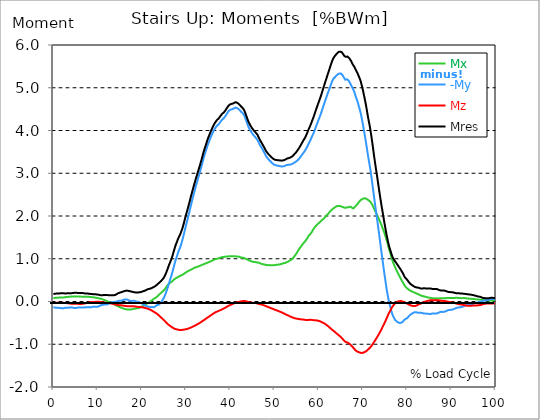
| Category |  Mx |  -My |  Mz |  Mres |
|---|---|---|---|---|
| 0.0 | 0.083 | -0.134 | -0.034 | 0.174 |
| 0.167348456675344 | 0.083 | -0.137 | -0.034 | 0.178 |
| 0.334696913350688 | 0.084 | -0.142 | -0.032 | 0.181 |
| 0.5020453700260321 | 0.086 | -0.143 | -0.031 | 0.184 |
| 0.669393826701376 | 0.087 | -0.146 | -0.031 | 0.186 |
| 0.83674228337672 | 0.088 | -0.147 | -0.031 | 0.187 |
| 1.0040907400520642 | 0.09 | -0.147 | -0.031 | 0.187 |
| 1.1621420602454444 | 0.091 | -0.147 | -0.032 | 0.189 |
| 1.3294905169207885 | 0.091 | -0.15 | -0.032 | 0.189 |
| 1.4968389735961325 | 0.091 | -0.153 | -0.034 | 0.192 |
| 1.6641874302714765 | 0.091 | -0.155 | -0.034 | 0.193 |
| 1.8315358869468206 | 0.091 | -0.158 | -0.034 | 0.195 |
| 1.9988843436221646 | 0.093 | -0.158 | -0.032 | 0.195 |
| 2.1662328002975086 | 0.093 | -0.158 | -0.031 | 0.195 |
| 2.333581256972853 | 0.094 | -0.156 | -0.031 | 0.193 |
| 2.5009297136481967 | 0.097 | -0.152 | -0.032 | 0.19 |
| 2.6682781703235405 | 0.1 | -0.146 | -0.034 | 0.187 |
| 2.8356266269988843 | 0.102 | -0.143 | -0.037 | 0.187 |
| 3.002975083674229 | 0.105 | -0.146 | -0.038 | 0.19 |
| 3.1703235403495724 | 0.106 | -0.147 | -0.04 | 0.193 |
| 3.337671997024917 | 0.108 | -0.146 | -0.041 | 0.193 |
| 3.4957233172182973 | 0.111 | -0.143 | -0.043 | 0.193 |
| 3.663071773893641 | 0.112 | -0.142 | -0.046 | 0.193 |
| 3.8304202305689854 | 0.114 | -0.139 | -0.049 | 0.192 |
| 3.997768687244329 | 0.115 | -0.137 | -0.052 | 0.193 |
| 4.165117143919673 | 0.117 | -0.139 | -0.053 | 0.195 |
| 4.332465600595017 | 0.117 | -0.143 | -0.053 | 0.198 |
| 4.499814057270361 | 0.118 | -0.147 | -0.053 | 0.201 |
| 4.667162513945706 | 0.118 | -0.15 | -0.053 | 0.202 |
| 4.834510970621049 | 0.117 | -0.152 | -0.053 | 0.204 |
| 5.001859427296393 | 0.118 | -0.152 | -0.052 | 0.204 |
| 5.169207883971737 | 0.119 | -0.15 | -0.052 | 0.204 |
| 5.336556340647081 | 0.119 | -0.147 | -0.053 | 0.202 |
| 5.503904797322425 | 0.119 | -0.143 | -0.055 | 0.199 |
| 5.671253253997769 | 0.118 | -0.139 | -0.056 | 0.198 |
| 5.82930457419115 | 0.117 | -0.137 | -0.058 | 0.196 |
| 5.996653030866494 | 0.115 | -0.137 | -0.058 | 0.196 |
| 6.164001487541838 | 0.115 | -0.14 | -0.058 | 0.198 |
| 6.331349944217181 | 0.114 | -0.142 | -0.056 | 0.198 |
| 6.498698400892526 | 0.114 | -0.143 | -0.055 | 0.198 |
| 6.66604685756787 | 0.114 | -0.143 | -0.052 | 0.196 |
| 6.833395314243213 | 0.112 | -0.142 | -0.049 | 0.195 |
| 7.000743770918558 | 0.112 | -0.14 | -0.046 | 0.192 |
| 7.168092227593902 | 0.112 | -0.136 | -0.043 | 0.189 |
| 7.335440684269246 | 0.114 | -0.133 | -0.041 | 0.186 |
| 7.50278914094459 | 0.114 | -0.131 | -0.038 | 0.186 |
| 7.6701375976199335 | 0.114 | -0.133 | -0.034 | 0.186 |
| 7.837486054295278 | 0.112 | -0.133 | -0.031 | 0.184 |
| 7.995537374488658 | 0.109 | -0.133 | -0.027 | 0.183 |
| 8.162885831164003 | 0.108 | -0.133 | -0.021 | 0.18 |
| 8.330234287839346 | 0.106 | -0.134 | -0.016 | 0.178 |
| 8.49758274451469 | 0.105 | -0.134 | -0.013 | 0.178 |
| 8.664931201190035 | 0.102 | -0.133 | -0.01 | 0.177 |
| 8.832279657865378 | 0.1 | -0.125 | -0.01 | 0.174 |
| 8.999628114540721 | 0.097 | -0.122 | -0.009 | 0.17 |
| 9.166976571216066 | 0.096 | -0.121 | -0.009 | 0.168 |
| 9.334325027891412 | 0.094 | -0.122 | -0.009 | 0.168 |
| 9.501673484566755 | 0.091 | -0.125 | -0.009 | 0.168 |
| 9.669021941242098 | 0.087 | -0.125 | -0.007 | 0.167 |
| 9.836370397917442 | 0.084 | -0.125 | -0.007 | 0.167 |
| 10.003718854592787 | 0.081 | -0.124 | -0.006 | 0.164 |
| 10.17106731126813 | 0.077 | -0.115 | -0.006 | 0.159 |
| 10.329118631461512 | 0.074 | -0.106 | -0.007 | 0.155 |
| 10.496467088136853 | 0.069 | -0.097 | -0.009 | 0.152 |
| 10.663815544812199 | 0.065 | -0.09 | -0.01 | 0.149 |
| 10.831164001487544 | 0.059 | -0.084 | -0.013 | 0.146 |
| 10.998512458162887 | 0.055 | -0.08 | -0.016 | 0.145 |
| 11.16586091483823 | 0.049 | -0.075 | -0.019 | 0.147 |
| 11.333209371513574 | 0.043 | -0.074 | -0.022 | 0.15 |
| 11.50055782818892 | 0.035 | -0.072 | -0.025 | 0.152 |
| 11.667906284864264 | 0.031 | -0.071 | -0.028 | 0.149 |
| 11.835254741539607 | 0.022 | -0.071 | -0.029 | 0.149 |
| 12.00260319821495 | 0.015 | -0.069 | -0.032 | 0.15 |
| 12.169951654890292 | 0.006 | -0.066 | -0.034 | 0.15 |
| 12.337300111565641 | -0.001 | -0.06 | -0.035 | 0.149 |
| 12.504648568240984 | -0.007 | -0.052 | -0.037 | 0.147 |
| 12.662699888434362 | -0.015 | -0.043 | -0.038 | 0.149 |
| 12.830048345109708 | -0.021 | -0.032 | -0.041 | 0.15 |
| 12.997396801785053 | -0.028 | -0.025 | -0.046 | 0.146 |
| 13.164745258460396 | -0.032 | -0.021 | -0.049 | 0.143 |
| 13.33209371513574 | -0.041 | -0.016 | -0.052 | 0.145 |
| 13.499442171811083 | -0.05 | -0.015 | -0.055 | 0.145 |
| 13.666790628486426 | -0.06 | -0.01 | -0.059 | 0.146 |
| 13.834139085161771 | -0.071 | -0.007 | -0.063 | 0.147 |
| 14.001487541837117 | -0.08 | -0.007 | -0.068 | 0.155 |
| 14.16883599851246 | -0.09 | -0.004 | -0.071 | 0.164 |
| 14.336184455187803 | -0.099 | -0.001 | -0.075 | 0.173 |
| 14.503532911863147 | -0.108 | 0.004 | -0.078 | 0.183 |
| 14.670881368538492 | -0.117 | 0.013 | -0.083 | 0.195 |
| 14.828932688731873 | -0.122 | 0.016 | -0.086 | 0.201 |
| 14.996281145407215 | -0.13 | 0.016 | -0.087 | 0.206 |
| 15.163629602082558 | -0.136 | 0.018 | -0.088 | 0.211 |
| 15.330978058757903 | -0.145 | 0.019 | -0.088 | 0.217 |
| 15.498326515433247 | -0.152 | 0.024 | -0.09 | 0.223 |
| 15.665674972108594 | -0.158 | 0.029 | -0.093 | 0.229 |
| 15.833023428783937 | -0.165 | 0.038 | -0.097 | 0.236 |
| 16.00037188545928 | -0.171 | 0.044 | -0.1 | 0.242 |
| 16.167720342134626 | -0.176 | 0.049 | -0.103 | 0.248 |
| 16.335068798809967 | -0.178 | 0.049 | -0.106 | 0.251 |
| 16.502417255485312 | -0.184 | 0.049 | -0.108 | 0.255 |
| 16.669765712160658 | -0.187 | 0.044 | -0.109 | 0.255 |
| 16.837114168836 | -0.189 | 0.037 | -0.111 | 0.252 |
| 17.004462625511344 | -0.189 | 0.029 | -0.111 | 0.248 |
| 17.16251394570472 | -0.189 | 0.022 | -0.111 | 0.243 |
| 17.32986240238007 | -0.19 | 0.016 | -0.111 | 0.24 |
| 17.497210859055414 | -0.189 | 0.016 | -0.111 | 0.237 |
| 17.664559315730756 | -0.184 | 0.01 | -0.109 | 0.232 |
| 17.8319077724061 | -0.18 | 0.013 | -0.109 | 0.227 |
| 17.999256229081443 | -0.174 | 0.016 | -0.111 | 0.223 |
| 18.166604685756788 | -0.171 | 0.018 | -0.112 | 0.218 |
| 18.333953142432133 | -0.168 | 0.015 | -0.114 | 0.215 |
| 18.501301599107478 | -0.164 | 0.009 | -0.117 | 0.211 |
| 18.668650055782823 | -0.162 | 0.001 | -0.119 | 0.211 |
| 18.835998512458165 | -0.161 | -0.003 | -0.122 | 0.211 |
| 19.00334696913351 | -0.158 | -0.007 | -0.124 | 0.211 |
| 19.170695425808855 | -0.158 | -0.006 | -0.127 | 0.214 |
| 19.338043882484197 | -0.153 | -0.009 | -0.128 | 0.214 |
| 19.496095202677576 | -0.145 | -0.019 | -0.128 | 0.214 |
| 19.66344365935292 | -0.137 | -0.031 | -0.13 | 0.218 |
| 19.830792116028263 | -0.128 | -0.037 | -0.133 | 0.223 |
| 19.998140572703612 | -0.119 | -0.047 | -0.134 | 0.229 |
| 20.165489029378953 | -0.111 | -0.058 | -0.137 | 0.236 |
| 20.3328374860543 | -0.1 | -0.068 | -0.14 | 0.242 |
| 20.500185942729644 | -0.088 | -0.08 | -0.145 | 0.246 |
| 20.667534399404985 | -0.075 | -0.093 | -0.149 | 0.252 |
| 20.83488285608033 | -0.063 | -0.099 | -0.153 | 0.26 |
| 21.002231312755672 | -0.056 | -0.106 | -0.158 | 0.27 |
| 21.16957976943102 | -0.047 | -0.112 | -0.162 | 0.279 |
| 21.336928226106362 | -0.038 | -0.118 | -0.168 | 0.288 |
| 21.504276682781704 | -0.027 | -0.122 | -0.174 | 0.292 |
| 21.67162513945705 | -0.016 | -0.124 | -0.181 | 0.295 |
| 21.82967645965043 | -0.006 | -0.125 | -0.189 | 0.298 |
| 21.997024916325774 | 0.009 | -0.133 | -0.198 | 0.304 |
| 22.16437337300112 | 0.019 | -0.13 | -0.206 | 0.31 |
| 22.33172182967646 | 0.029 | -0.128 | -0.217 | 0.319 |
| 22.499070286351806 | 0.046 | -0.133 | -0.226 | 0.329 |
| 22.666418743027148 | 0.06 | -0.136 | -0.237 | 0.338 |
| 22.833767199702496 | 0.071 | -0.13 | -0.249 | 0.347 |
| 23.00111565637784 | 0.081 | -0.118 | -0.26 | 0.357 |
| 23.168464113053183 | 0.09 | -0.103 | -0.27 | 0.367 |
| 23.335812569728528 | 0.102 | -0.088 | -0.28 | 0.383 |
| 23.50316102640387 | 0.117 | -0.081 | -0.294 | 0.4 |
| 23.670509483079215 | 0.134 | -0.08 | -0.308 | 0.416 |
| 23.83785793975456 | 0.153 | -0.075 | -0.323 | 0.432 |
| 23.995909259947936 | 0.171 | -0.06 | -0.339 | 0.445 |
| 24.163257716623285 | 0.186 | -0.041 | -0.355 | 0.46 |
| 24.330606173298627 | 0.201 | -0.021 | -0.372 | 0.476 |
| 24.49795462997397 | 0.214 | 0.003 | -0.386 | 0.494 |
| 24.665303086649313 | 0.23 | 0.029 | -0.403 | 0.515 |
| 24.83265154332466 | 0.246 | 0.06 | -0.42 | 0.538 |
| 25.0 | 0.264 | 0.091 | -0.437 | 0.563 |
| 25.167348456675345 | 0.283 | 0.128 | -0.454 | 0.593 |
| 25.334696913350694 | 0.307 | 0.171 | -0.472 | 0.631 |
| 25.502045370026035 | 0.332 | 0.218 | -0.49 | 0.671 |
| 25.669393826701377 | 0.357 | 0.268 | -0.509 | 0.715 |
| 25.836742283376722 | 0.378 | 0.319 | -0.524 | 0.76 |
| 26.004090740052067 | 0.401 | 0.378 | -0.54 | 0.811 |
| 26.17143919672741 | 0.42 | 0.432 | -0.553 | 0.857 |
| 26.329490516920792 | 0.432 | 0.49 | -0.566 | 0.901 |
| 26.49683897359613 | 0.441 | 0.543 | -0.578 | 0.942 |
| 26.66418743027148 | 0.453 | 0.596 | -0.59 | 0.987 |
| 26.831535886946828 | 0.469 | 0.656 | -0.602 | 1.037 |
| 26.998884343622166 | 0.485 | 0.72 | -0.614 | 1.091 |
| 27.166232800297514 | 0.503 | 0.786 | -0.625 | 1.153 |
| 27.333581256972852 | 0.519 | 0.853 | -0.634 | 1.212 |
| 27.5009297136482 | 0.531 | 0.917 | -0.642 | 1.27 |
| 27.668278170323543 | 0.543 | 0.976 | -0.646 | 1.323 |
| 27.835626626998888 | 0.553 | 1.028 | -0.65 | 1.369 |
| 28.002975083674233 | 0.562 | 1.08 | -0.653 | 1.412 |
| 28.170323540349575 | 0.572 | 1.134 | -0.658 | 1.459 |
| 28.33767199702492 | 0.583 | 1.183 | -0.662 | 1.5 |
| 28.50502045370026 | 0.59 | 1.223 | -0.665 | 1.532 |
| 28.663071773893645 | 0.6 | 1.264 | -0.668 | 1.568 |
| 28.830420230568986 | 0.609 | 1.316 | -0.67 | 1.612 |
| 28.99776868724433 | 0.617 | 1.376 | -0.667 | 1.661 |
| 29.165117143919673 | 0.622 | 1.435 | -0.664 | 1.708 |
| 29.33246560059502 | 0.633 | 1.503 | -0.659 | 1.768 |
| 29.499814057270367 | 0.645 | 1.572 | -0.656 | 1.83 |
| 29.66716251394571 | 0.659 | 1.643 | -0.656 | 1.897 |
| 29.834510970621054 | 0.673 | 1.715 | -0.652 | 1.965 |
| 30.00185942729639 | 0.683 | 1.786 | -0.649 | 2.029 |
| 30.169207883971744 | 0.693 | 1.854 | -0.646 | 2.091 |
| 30.33655634064708 | 0.704 | 1.919 | -0.639 | 2.15 |
| 30.50390479732243 | 0.714 | 1.988 | -0.633 | 2.215 |
| 30.671253253997772 | 0.721 | 2.06 | -0.627 | 2.28 |
| 30.829304574191156 | 0.729 | 2.133 | -0.619 | 2.347 |
| 30.996653030866494 | 0.737 | 2.204 | -0.612 | 2.413 |
| 31.164001487541842 | 0.748 | 2.276 | -0.606 | 2.481 |
| 31.331349944217187 | 0.757 | 2.347 | -0.599 | 2.547 |
| 31.498698400892525 | 0.765 | 2.417 | -0.591 | 2.611 |
| 31.666046857567874 | 0.776 | 2.482 | -0.581 | 2.673 |
| 31.833395314243212 | 0.786 | 2.546 | -0.572 | 2.733 |
| 32.00074377091856 | 0.794 | 2.611 | -0.565 | 2.794 |
| 32.1680922275939 | 0.799 | 2.677 | -0.555 | 2.855 |
| 32.33544068426925 | 0.804 | 2.739 | -0.546 | 2.913 |
| 32.50278914094459 | 0.808 | 2.798 | -0.537 | 2.966 |
| 32.670137597619934 | 0.816 | 2.864 | -0.527 | 3.028 |
| 32.83748605429528 | 0.824 | 2.92 | -0.519 | 3.083 |
| 33.004834510970625 | 0.83 | 2.978 | -0.509 | 3.139 |
| 33.162885831164004 | 0.836 | 3.038 | -0.497 | 3.196 |
| 33.33023428783935 | 0.844 | 3.103 | -0.484 | 3.258 |
| 33.497582744514695 | 0.851 | 3.165 | -0.472 | 3.317 |
| 33.664931201190036 | 0.858 | 3.232 | -0.462 | 3.381 |
| 33.83227965786538 | 0.866 | 3.301 | -0.45 | 3.447 |
| 33.99962811454073 | 0.873 | 3.364 | -0.438 | 3.507 |
| 34.16697657121607 | 0.881 | 3.422 | -0.426 | 3.563 |
| 34.33432502789141 | 0.886 | 3.478 | -0.414 | 3.618 |
| 34.50167348456676 | 0.894 | 3.531 | -0.401 | 3.67 |
| 34.6690219412421 | 0.9 | 3.587 | -0.389 | 3.724 |
| 34.83637039791744 | 0.907 | 3.642 | -0.378 | 3.777 |
| 35.00371885459279 | 0.914 | 3.69 | -0.366 | 3.826 |
| 35.17106731126814 | 0.923 | 3.733 | -0.354 | 3.867 |
| 35.338415767943474 | 0.931 | 3.777 | -0.342 | 3.912 |
| 35.49646708813686 | 0.937 | 3.822 | -0.33 | 3.954 |
| 35.6638155448122 | 0.944 | 3.861 | -0.319 | 3.996 |
| 35.831164001487544 | 0.954 | 3.903 | -0.307 | 4.035 |
| 35.998512458162885 | 0.963 | 3.94 | -0.295 | 4.072 |
| 36.165860914838234 | 0.972 | 3.973 | -0.285 | 4.108 |
| 36.333209371513576 | 0.979 | 4.01 | -0.273 | 4.145 |
| 36.50055782818892 | 0.985 | 4.041 | -0.263 | 4.174 |
| 36.667906284864266 | 0.991 | 4.066 | -0.251 | 4.199 |
| 36.83525474153961 | 0.996 | 4.09 | -0.242 | 4.223 |
| 37.002603198214956 | 1 | 4.114 | -0.236 | 4.248 |
| 37.1699516548903 | 1.004 | 4.128 | -0.23 | 4.263 |
| 37.337300111565646 | 1.009 | 4.142 | -0.224 | 4.276 |
| 37.50464856824098 | 1.016 | 4.158 | -0.217 | 4.294 |
| 37.66269988843437 | 1.024 | 4.186 | -0.206 | 4.322 |
| 37.83004834510971 | 1.029 | 4.211 | -0.198 | 4.347 |
| 37.99739680178505 | 1.034 | 4.229 | -0.19 | 4.363 |
| 38.16474525846039 | 1.037 | 4.257 | -0.181 | 4.391 |
| 38.33209371513574 | 1.04 | 4.271 | -0.174 | 4.406 |
| 38.49944217181109 | 1.043 | 4.285 | -0.167 | 4.417 |
| 38.666790628486424 | 1.044 | 4.301 | -0.158 | 4.434 |
| 38.83413908516178 | 1.047 | 4.327 | -0.147 | 4.46 |
| 39.001487541837115 | 1.05 | 4.353 | -0.137 | 4.485 |
| 39.16883599851246 | 1.052 | 4.382 | -0.127 | 4.513 |
| 39.336184455187805 | 1.053 | 4.407 | -0.117 | 4.538 |
| 39.503532911863154 | 1.056 | 4.437 | -0.108 | 4.566 |
| 39.670881368538495 | 1.058 | 4.457 | -0.097 | 4.586 |
| 39.83822982521384 | 1.058 | 4.473 | -0.088 | 4.602 |
| 39.996281145407224 | 1.059 | 4.484 | -0.081 | 4.612 |
| 40.163629602082565 | 1.06 | 4.491 | -0.074 | 4.619 |
| 40.33097805875791 | 1.059 | 4.494 | -0.068 | 4.622 |
| 40.498326515433256 | 1.059 | 4.5 | -0.06 | 4.627 |
| 40.6656749721086 | 1.059 | 4.509 | -0.052 | 4.636 |
| 40.83302342878393 | 1.058 | 4.516 | -0.044 | 4.643 |
| 41.00037188545929 | 1.058 | 4.528 | -0.035 | 4.653 |
| 41.16772034213463 | 1.056 | 4.535 | -0.028 | 4.662 |
| 41.33506879880997 | 1.055 | 4.532 | -0.024 | 4.659 |
| 41.50241725548531 | 1.053 | 4.527 | -0.019 | 4.652 |
| 41.66976571216066 | 1.052 | 4.516 | -0.015 | 4.642 |
| 41.837114168836 | 1.049 | 4.504 | -0.012 | 4.63 |
| 42.004462625511344 | 1.047 | 4.493 | -0.007 | 4.618 |
| 42.17181108218669 | 1.04 | 4.471 | -0.003 | 4.594 |
| 42.32986240238007 | 1.034 | 4.453 | 0.001 | 4.575 |
| 42.497210859055414 | 1.029 | 4.434 | 0.004 | 4.556 |
| 42.66455931573076 | 1.024 | 4.416 | 0.007 | 4.537 |
| 42.831907772406105 | 1.024 | 4.403 | 0.01 | 4.524 |
| 42.999256229081446 | 1.022 | 4.385 | 0.012 | 4.507 |
| 43.16660468575679 | 1.018 | 4.351 | 0.01 | 4.472 |
| 43.33395314243214 | 1.009 | 4.307 | 0.009 | 4.428 |
| 43.50130159910748 | 1 | 4.26 | 0.004 | 4.379 |
| 43.66865005578282 | 0.991 | 4.211 | 0 | 4.332 |
| 43.83599851245817 | 0.982 | 4.162 | -0.004 | 4.283 |
| 44.00334696913351 | 0.973 | 4.115 | -0.01 | 4.236 |
| 44.17069542580886 | 0.966 | 4.071 | -0.016 | 4.192 |
| 44.3380438824842 | 0.959 | 4.038 | -0.021 | 4.159 |
| 44.49609520267758 | 0.951 | 4.006 | -0.024 | 4.125 |
| 44.66344365935292 | 0.944 | 3.979 | -0.025 | 4.099 |
| 44.83079211602827 | 0.937 | 3.951 | -0.028 | 4.069 |
| 44.99814057270361 | 0.932 | 3.926 | -0.029 | 4.044 |
| 45.16548902937895 | 0.929 | 3.901 | -0.031 | 4.021 |
| 45.332837486054295 | 0.926 | 3.881 | -0.032 | 4 |
| 45.500185942729644 | 0.923 | 3.861 | -0.034 | 3.981 |
| 45.66753439940499 | 0.922 | 3.844 | -0.037 | 3.962 |
| 45.83488285608033 | 0.919 | 3.823 | -0.04 | 3.941 |
| 46.00223131275568 | 0.914 | 3.802 | -0.041 | 3.922 |
| 46.16957976943102 | 0.914 | 3.777 | -0.046 | 3.897 |
| 46.336928226106366 | 0.91 | 3.74 | -0.053 | 3.86 |
| 46.50427668278171 | 0.901 | 3.704 | -0.058 | 3.822 |
| 46.671625139457056 | 0.897 | 3.667 | -0.063 | 3.786 |
| 46.829676459650436 | 0.889 | 3.64 | -0.066 | 3.757 |
| 46.99702491632577 | 0.882 | 3.611 | -0.069 | 3.727 |
| 47.16437337300112 | 0.876 | 3.583 | -0.074 | 3.698 |
| 47.33172182967646 | 0.873 | 3.55 | -0.08 | 3.667 |
| 47.49907028635181 | 0.87 | 3.518 | -0.086 | 3.634 |
| 47.66641874302716 | 0.866 | 3.488 | -0.091 | 3.605 |
| 47.83376719970249 | 0.863 | 3.456 | -0.099 | 3.572 |
| 48.001115656377834 | 0.858 | 3.419 | -0.108 | 3.535 |
| 48.16846411305319 | 0.853 | 3.391 | -0.114 | 3.509 |
| 48.33581256972853 | 0.848 | 3.37 | -0.118 | 3.487 |
| 48.50316102640387 | 0.85 | 3.345 | -0.125 | 3.463 |
| 48.67050948307921 | 0.853 | 3.323 | -0.134 | 3.442 |
| 48.837857939754564 | 0.851 | 3.304 | -0.14 | 3.423 |
| 49.005206396429905 | 0.848 | 3.285 | -0.146 | 3.404 |
| 49.163257716623285 | 0.848 | 3.27 | -0.153 | 3.389 |
| 49.33060617329863 | 0.85 | 3.251 | -0.161 | 3.372 |
| 49.49795462997397 | 0.85 | 3.235 | -0.168 | 3.357 |
| 49.66530308664932 | 0.85 | 3.22 | -0.174 | 3.342 |
| 49.832651543324666 | 0.848 | 3.206 | -0.181 | 3.329 |
| 50.0 | 0.851 | 3.195 | -0.189 | 3.319 |
| 50.16734845667534 | 0.854 | 3.19 | -0.195 | 3.314 |
| 50.33469691335069 | 0.857 | 3.186 | -0.202 | 3.311 |
| 50.50204537002604 | 0.86 | 3.181 | -0.208 | 3.308 |
| 50.66939382670139 | 0.86 | 3.178 | -0.214 | 3.307 |
| 50.836742283376715 | 0.863 | 3.176 | -0.22 | 3.304 |
| 51.00409074005207 | 0.864 | 3.173 | -0.227 | 3.301 |
| 51.17143919672741 | 0.867 | 3.17 | -0.235 | 3.301 |
| 51.32949051692079 | 0.872 | 3.167 | -0.242 | 3.299 |
| 51.496838973596134 | 0.876 | 3.161 | -0.249 | 3.295 |
| 51.66418743027148 | 0.882 | 3.156 | -0.257 | 3.294 |
| 51.831535886946824 | 0.888 | 3.159 | -0.265 | 3.298 |
| 51.99888434362217 | 0.894 | 3.164 | -0.273 | 3.304 |
| 52.16623280029752 | 0.897 | 3.167 | -0.283 | 3.307 |
| 52.33358125697285 | 0.9 | 3.171 | -0.292 | 3.313 |
| 52.5009297136482 | 0.907 | 3.18 | -0.299 | 3.323 |
| 52.668278170323546 | 0.914 | 3.189 | -0.307 | 3.335 |
| 52.835626626998895 | 0.922 | 3.195 | -0.314 | 3.344 |
| 53.00297508367424 | 0.931 | 3.196 | -0.323 | 3.348 |
| 53.17032354034958 | 0.94 | 3.198 | -0.332 | 3.353 |
| 53.33767199702492 | 0.951 | 3.195 | -0.341 | 3.355 |
| 53.50502045370027 | 0.96 | 3.201 | -0.348 | 3.364 |
| 53.663071773893655 | 0.971 | 3.205 | -0.355 | 3.372 |
| 53.83042023056899 | 0.981 | 3.211 | -0.363 | 3.382 |
| 53.99776868724433 | 0.996 | 3.217 | -0.37 | 3.394 |
| 54.16511714391967 | 1.012 | 3.227 | -0.378 | 3.409 |
| 54.33246560059503 | 1.035 | 3.239 | -0.383 | 3.428 |
| 54.49981405727037 | 1.056 | 3.249 | -0.389 | 3.447 |
| 54.667162513945705 | 1.08 | 3.261 | -0.394 | 3.465 |
| 54.834510970621054 | 1.105 | 3.271 | -0.398 | 3.484 |
| 55.0018594272964 | 1.131 | 3.282 | -0.401 | 3.504 |
| 55.169207883971744 | 1.161 | 3.298 | -0.404 | 3.529 |
| 55.336556340647086 | 1.19 | 3.314 | -0.407 | 3.556 |
| 55.50390479732243 | 1.214 | 3.332 | -0.41 | 3.581 |
| 55.671253253997776 | 1.24 | 3.351 | -0.413 | 3.609 |
| 55.83860171067312 | 1.264 | 3.375 | -0.416 | 3.639 |
| 55.9966530308665 | 1.288 | 3.4 | -0.417 | 3.67 |
| 56.16400148754184 | 1.313 | 3.423 | -0.42 | 3.701 |
| 56.33134994421718 | 1.336 | 3.448 | -0.422 | 3.732 |
| 56.498698400892536 | 1.358 | 3.472 | -0.423 | 3.763 |
| 56.66604685756788 | 1.379 | 3.496 | -0.425 | 3.791 |
| 56.83339531424321 | 1.398 | 3.519 | -0.428 | 3.819 |
| 57.00074377091856 | 1.417 | 3.547 | -0.431 | 3.853 |
| 57.16809222759391 | 1.442 | 3.577 | -0.432 | 3.889 |
| 57.33544068426925 | 1.471 | 3.611 | -0.432 | 3.929 |
| 57.5027891409446 | 1.496 | 3.646 | -0.432 | 3.972 |
| 57.670137597619934 | 1.528 | 3.681 | -0.432 | 4.016 |
| 57.83748605429528 | 1.549 | 3.714 | -0.431 | 4.053 |
| 58.004834510970625 | 1.565 | 3.749 | -0.428 | 4.091 |
| 58.16288583116401 | 1.584 | 3.786 | -0.428 | 4.133 |
| 58.330234287839346 | 1.609 | 3.826 | -0.429 | 4.178 |
| 58.497582744514695 | 1.636 | 3.867 | -0.431 | 4.227 |
| 58.66493120119004 | 1.668 | 3.901 | -0.435 | 4.27 |
| 58.832279657865385 | 1.699 | 3.938 | -0.44 | 4.316 |
| 58.999628114540734 | 1.721 | 3.984 | -0.44 | 4.366 |
| 59.16697657121607 | 1.745 | 4.029 | -0.44 | 4.417 |
| 59.33432502789142 | 1.764 | 4.077 | -0.44 | 4.469 |
| 59.50167348456676 | 1.783 | 4.124 | -0.441 | 4.519 |
| 59.66902194124211 | 1.802 | 4.168 | -0.445 | 4.569 |
| 59.83637039791745 | 1.819 | 4.215 | -0.45 | 4.619 |
| 60.00371885459278 | 1.832 | 4.261 | -0.453 | 4.665 |
| 60.17106731126813 | 1.848 | 4.304 | -0.459 | 4.712 |
| 60.33841576794349 | 1.866 | 4.35 | -0.465 | 4.761 |
| 60.49646708813685 | 1.881 | 4.395 | -0.472 | 4.81 |
| 60.6638155448122 | 1.895 | 4.447 | -0.481 | 4.864 |
| 60.831164001487544 | 1.913 | 4.503 | -0.49 | 4.923 |
| 60.99851245816289 | 1.929 | 4.558 | -0.499 | 4.979 |
| 61.16586091483824 | 1.942 | 4.608 | -0.506 | 5.032 |
| 61.333209371513576 | 1.96 | 4.659 | -0.516 | 5.087 |
| 61.50055782818892 | 1.978 | 4.712 | -0.528 | 5.143 |
| 61.667906284864266 | 2 | 4.758 | -0.541 | 5.195 |
| 61.835254741539615 | 2.022 | 4.805 | -0.555 | 5.248 |
| 62.002603198214956 | 2.04 | 4.857 | -0.568 | 5.302 |
| 62.16995165489029 | 2.055 | 4.906 | -0.58 | 5.354 |
| 62.33730011156564 | 2.077 | 4.951 | -0.596 | 5.407 |
| 62.504648568240995 | 2.1 | 4.999 | -0.612 | 5.46 |
| 62.67199702491633 | 2.118 | 5.049 | -0.628 | 5.515 |
| 62.83004834510971 | 2.136 | 5.094 | -0.645 | 5.565 |
| 62.99739680178505 | 2.15 | 5.142 | -0.659 | 5.617 |
| 63.1647452584604 | 2.164 | 5.181 | -0.671 | 5.659 |
| 63.33209371513575 | 2.177 | 5.214 | -0.684 | 5.696 |
| 63.4994421718111 | 2.192 | 5.235 | -0.699 | 5.723 |
| 63.666790628486424 | 2.205 | 5.246 | -0.714 | 5.74 |
| 63.83413908516177 | 2.215 | 5.268 | -0.73 | 5.767 |
| 64.00148754183712 | 2.226 | 5.286 | -0.745 | 5.789 |
| 64.16883599851248 | 2.233 | 5.301 | -0.758 | 5.807 |
| 64.3361844551878 | 2.236 | 5.316 | -0.773 | 5.824 |
| 64.50353291186315 | 2.236 | 5.329 | -0.786 | 5.838 |
| 64.6708813685385 | 2.236 | 5.332 | -0.801 | 5.844 |
| 64.83822982521384 | 2.233 | 5.332 | -0.817 | 5.845 |
| 65.00557828188919 | 2.23 | 5.333 | -0.83 | 5.847 |
| 65.16362960208257 | 2.221 | 5.322 | -0.848 | 5.835 |
| 65.3309780587579 | 2.212 | 5.301 | -0.867 | 5.816 |
| 65.49832651543326 | 2.206 | 5.271 | -0.888 | 5.791 |
| 65.6656749721086 | 2.198 | 5.243 | -0.907 | 5.764 |
| 65.83302342878395 | 2.195 | 5.214 | -0.925 | 5.739 |
| 66.00037188545929 | 2.192 | 5.187 | -0.941 | 5.717 |
| 66.16772034213463 | 2.195 | 5.192 | -0.948 | 5.723 |
| 66.33506879880998 | 2.199 | 5.199 | -0.954 | 5.732 |
| 66.50241725548531 | 2.202 | 5.193 | -0.962 | 5.73 |
| 66.66976571216065 | 2.206 | 5.177 | -0.971 | 5.717 |
| 66.83711416883601 | 2.209 | 5.155 | -0.979 | 5.699 |
| 67.00446262551135 | 2.209 | 5.128 | -0.993 | 5.677 |
| 67.1718110821867 | 2.218 | 5.093 | -1.01 | 5.652 |
| 67.32986240238007 | 2.221 | 5.058 | -1.029 | 5.625 |
| 67.49721085905541 | 2.195 | 5.024 | -1.043 | 5.586 |
| 67.66455931573076 | 2.18 | 4.99 | -1.062 | 5.552 |
| 67.83190777240611 | 2.177 | 4.954 | -1.083 | 5.524 |
| 67.99925622908145 | 2.192 | 4.914 | -1.103 | 5.497 |
| 68.16660468575678 | 2.211 | 4.863 | -1.125 | 5.465 |
| 68.33395314243214 | 2.232 | 4.808 | -1.143 | 5.428 |
| 68.50130159910749 | 2.251 | 4.755 | -1.156 | 5.392 |
| 68.66865005578282 | 2.268 | 4.709 | -1.168 | 5.361 |
| 68.83599851245816 | 2.291 | 4.656 | -1.176 | 5.326 |
| 69.00334696913352 | 2.314 | 4.594 | -1.183 | 5.285 |
| 69.17069542580886 | 2.336 | 4.534 | -1.189 | 5.242 |
| 69.3380438824842 | 2.355 | 4.471 | -1.196 | 5.198 |
| 69.50539233915956 | 2.373 | 4.401 | -1.202 | 5.147 |
| 69.66344365935292 | 2.386 | 4.319 | -1.204 | 5.084 |
| 69.83079211602826 | 2.395 | 4.229 | -1.202 | 5.012 |
| 69.99814057270362 | 2.404 | 4.136 | -1.199 | 4.938 |
| 70.16548902937896 | 2.41 | 4.038 | -1.195 | 4.857 |
| 70.33283748605429 | 2.414 | 3.937 | -1.186 | 4.774 |
| 70.50018594272964 | 2.414 | 3.838 | -1.177 | 4.69 |
| 70.667534399405 | 2.41 | 3.733 | -1.167 | 4.6 |
| 70.83488285608033 | 2.401 | 3.622 | -1.153 | 4.503 |
| 71.00223131275568 | 2.388 | 3.507 | -1.137 | 4.4 |
| 71.16957976943102 | 2.376 | 3.398 | -1.121 | 4.301 |
| 71.33692822610637 | 2.363 | 3.298 | -1.106 | 4.211 |
| 71.50427668278171 | 2.348 | 3.199 | -1.09 | 4.122 |
| 71.67162513945706 | 2.332 | 3.09 | -1.072 | 4.024 |
| 71.8389735961324 | 2.308 | 2.972 | -1.052 | 3.914 |
| 71.99702491632577 | 2.282 | 2.847 | -1.029 | 3.798 |
| 72.16437337300113 | 2.251 | 2.714 | -1.004 | 3.674 |
| 72.33172182967647 | 2.214 | 2.584 | -0.978 | 3.547 |
| 72.49907028635181 | 2.174 | 2.453 | -0.95 | 3.419 |
| 72.66641874302715 | 2.137 | 2.323 | -0.922 | 3.295 |
| 72.8337671997025 | 2.102 | 2.196 | -0.895 | 3.177 |
| 73.00111565637783 | 2.066 | 2.071 | -0.867 | 3.06 |
| 73.16846411305319 | 2.034 | 1.948 | -0.841 | 2.953 |
| 73.33581256972853 | 1.997 | 1.823 | -0.811 | 2.835 |
| 73.50316102640387 | 1.954 | 1.695 | -0.78 | 2.714 |
| 73.67050948307921 | 1.914 | 1.565 | -0.751 | 2.597 |
| 73.83785793975457 | 1.875 | 1.434 | -0.72 | 2.484 |
| 74.00520639642991 | 1.835 | 1.301 | -0.689 | 2.372 |
| 74.16325771662328 | 1.794 | 1.171 | -0.656 | 2.263 |
| 74.33060617329863 | 1.748 | 1.041 | -0.618 | 2.161 |
| 74.49795462997398 | 1.701 | 0.913 | -0.583 | 2.058 |
| 74.66530308664932 | 1.655 | 0.788 | -0.549 | 1.954 |
| 74.83265154332466 | 1.608 | 0.658 | -0.515 | 1.85 |
| 75.00000000000001 | 1.555 | 0.541 | -0.476 | 1.757 |
| 75.16734845667534 | 1.5 | 0.422 | -0.438 | 1.659 |
| 75.3346969133507 | 1.442 | 0.304 | -0.397 | 1.56 |
| 75.50204537002605 | 1.383 | 0.206 | -0.36 | 1.481 |
| 75.66939382670138 | 1.319 | 0.108 | -0.319 | 1.398 |
| 75.83674228337672 | 1.257 | 0.025 | -0.282 | 1.326 |
| 76.00409074005208 | 1.196 | -0.05 | -0.248 | 1.26 |
| 76.17143919672742 | 1.139 | -0.117 | -0.215 | 1.206 |
| 76.33878765340276 | 1.075 | -0.186 | -0.183 | 1.149 |
| 76.49683897359614 | 1.012 | -0.251 | -0.149 | 1.091 |
| 76.66418743027148 | 0.959 | -0.302 | -0.121 | 1.049 |
| 76.83153588694682 | 0.91 | -0.345 | -0.096 | 1.009 |
| 76.99888434362218 | 0.869 | -0.378 | -0.075 | 0.982 |
| 77.16623280029752 | 0.824 | -0.413 | -0.053 | 0.953 |
| 77.33358125697285 | 0.788 | -0.438 | -0.035 | 0.931 |
| 77.5009297136482 | 0.751 | -0.459 | -0.022 | 0.907 |
| 77.66827817032356 | 0.715 | -0.471 | -0.01 | 0.882 |
| 77.83562662699889 | 0.68 | -0.481 | -0.001 | 0.855 |
| 78.00297508367423 | 0.643 | -0.491 | 0.003 | 0.829 |
| 78.17032354034959 | 0.609 | -0.5 | 0.007 | 0.804 |
| 78.33767199702493 | 0.577 | -0.503 | 0.01 | 0.777 |
| 78.50502045370027 | 0.544 | -0.5 | 0.012 | 0.751 |
| 78.67236891037561 | 0.513 | -0.494 | 0.01 | 0.724 |
| 78.83042023056899 | 0.479 | -0.488 | 0.006 | 0.696 |
| 78.99776868724433 | 0.451 | -0.475 | 0.001 | 0.667 |
| 79.16511714391969 | 0.419 | -0.456 | -0.007 | 0.633 |
| 79.33246560059503 | 0.388 | -0.429 | -0.021 | 0.593 |
| 79.49981405727036 | 0.364 | -0.412 | -0.031 | 0.563 |
| 79.66716251394571 | 0.341 | -0.406 | -0.035 | 0.541 |
| 79.83451097062107 | 0.322 | -0.403 | -0.041 | 0.527 |
| 80.00185942729641 | 0.307 | -0.392 | -0.047 | 0.509 |
| 80.16920788397174 | 0.292 | -0.372 | -0.058 | 0.484 |
| 80.33655634064709 | 0.279 | -0.35 | -0.069 | 0.459 |
| 80.50390479732243 | 0.265 | -0.329 | -0.08 | 0.437 |
| 80.67125325399778 | 0.255 | -0.313 | -0.087 | 0.419 |
| 80.83860171067312 | 0.246 | -0.301 | -0.091 | 0.404 |
| 80.99665303086651 | 0.237 | -0.288 | -0.097 | 0.389 |
| 81.16400148754184 | 0.23 | -0.276 | -0.102 | 0.376 |
| 81.3313499442172 | 0.223 | -0.267 | -0.105 | 0.366 |
| 81.49869840089255 | 0.215 | -0.26 | -0.105 | 0.355 |
| 81.66604685756786 | 0.208 | -0.252 | -0.106 | 0.345 |
| 81.83339531424322 | 0.201 | -0.248 | -0.105 | 0.338 |
| 82.00074377091858 | 0.193 | -0.249 | -0.097 | 0.332 |
| 82.16809222759392 | 0.186 | -0.254 | -0.09 | 0.329 |
| 82.33544068426926 | 0.177 | -0.26 | -0.081 | 0.326 |
| 82.50278914094459 | 0.168 | -0.263 | -0.072 | 0.323 |
| 82.67013759761994 | 0.161 | -0.264 | -0.065 | 0.32 |
| 82.83748605429528 | 0.153 | -0.263 | -0.059 | 0.313 |
| 83.00483451097062 | 0.146 | -0.261 | -0.052 | 0.307 |
| 83.17218296764597 | 0.139 | -0.263 | -0.044 | 0.302 |
| 83.33023428783935 | 0.131 | -0.267 | -0.035 | 0.302 |
| 83.4975827445147 | 0.127 | -0.273 | -0.025 | 0.305 |
| 83.66493120119004 | 0.122 | -0.279 | -0.018 | 0.308 |
| 83.83227965786537 | 0.118 | -0.283 | -0.012 | 0.31 |
| 83.99962811454073 | 0.114 | -0.283 | -0.004 | 0.308 |
| 84.16697657121607 | 0.109 | -0.282 | 0.001 | 0.304 |
| 84.33432502789142 | 0.105 | -0.283 | 0.006 | 0.304 |
| 84.50167348456677 | 0.1 | -0.285 | 0.01 | 0.302 |
| 84.6690219412421 | 0.096 | -0.286 | 0.015 | 0.302 |
| 84.83637039791745 | 0.091 | -0.289 | 0.019 | 0.304 |
| 85.0037188545928 | 0.088 | -0.291 | 0.024 | 0.305 |
| 85.17106731126813 | 0.086 | -0.292 | 0.028 | 0.305 |
| 85.33841576794349 | 0.083 | -0.291 | 0.031 | 0.304 |
| 85.50576422461883 | 0.08 | -0.286 | 0.031 | 0.299 |
| 85.66381554481221 | 0.078 | -0.282 | 0.031 | 0.295 |
| 85.83116400148755 | 0.075 | -0.28 | 0.031 | 0.292 |
| 85.99851245816289 | 0.074 | -0.28 | 0.031 | 0.292 |
| 86.16586091483823 | 0.072 | -0.283 | 0.031 | 0.294 |
| 86.33320937151358 | 0.072 | -0.283 | 0.031 | 0.295 |
| 86.50055782818893 | 0.074 | -0.285 | 0.032 | 0.296 |
| 86.66790628486427 | 0.074 | -0.282 | 0.032 | 0.294 |
| 86.83525474153961 | 0.072 | -0.274 | 0.031 | 0.286 |
| 87.00260319821496 | 0.072 | -0.267 | 0.029 | 0.279 |
| 87.16995165489031 | 0.072 | -0.26 | 0.027 | 0.271 |
| 87.33730011156564 | 0.074 | -0.251 | 0.024 | 0.264 |
| 87.504648568241 | 0.074 | -0.246 | 0.021 | 0.26 |
| 87.67199702491634 | 0.074 | -0.242 | 0.018 | 0.257 |
| 87.83004834510972 | 0.074 | -0.243 | 0.016 | 0.257 |
| 87.99739680178506 | 0.074 | -0.243 | 0.015 | 0.257 |
| 88.1647452584604 | 0.074 | -0.243 | 0.013 | 0.258 |
| 88.33209371513574 | 0.074 | -0.242 | 0.012 | 0.257 |
| 88.49944217181108 | 0.077 | -0.239 | 0.01 | 0.254 |
| 88.66679062848644 | 0.078 | -0.232 | 0.007 | 0.248 |
| 88.83413908516178 | 0.08 | -0.224 | 0.006 | 0.242 |
| 89.00148754183712 | 0.081 | -0.215 | 0.001 | 0.235 |
| 89.16883599851246 | 0.083 | -0.208 | -0.003 | 0.229 |
| 89.33618445518782 | 0.083 | -0.201 | -0.007 | 0.223 |
| 89.50353291186315 | 0.083 | -0.198 | -0.01 | 0.22 |
| 89.6708813685385 | 0.081 | -0.198 | -0.015 | 0.22 |
| 89.83822982521386 | 0.081 | -0.196 | -0.018 | 0.22 |
| 90.00557828188919 | 0.081 | -0.193 | -0.021 | 0.218 |
| 90.16362960208257 | 0.081 | -0.192 | -0.022 | 0.217 |
| 90.3309780587579 | 0.081 | -0.186 | -0.025 | 0.215 |
| 90.49832651543326 | 0.083 | -0.18 | -0.028 | 0.211 |
| 90.66567497210859 | 0.084 | -0.171 | -0.032 | 0.205 |
| 90.83302342878395 | 0.084 | -0.164 | -0.038 | 0.199 |
| 91.00037188545929 | 0.086 | -0.156 | -0.044 | 0.196 |
| 91.16772034213463 | 0.086 | -0.149 | -0.049 | 0.193 |
| 91.33506879880998 | 0.086 | -0.143 | -0.055 | 0.192 |
| 91.50241725548533 | 0.084 | -0.14 | -0.059 | 0.192 |
| 91.66976571216065 | 0.083 | -0.139 | -0.063 | 0.192 |
| 91.83711416883601 | 0.081 | -0.136 | -0.065 | 0.19 |
| 92.00446262551137 | 0.08 | -0.134 | -0.068 | 0.189 |
| 92.1718110821867 | 0.078 | -0.133 | -0.071 | 0.189 |
| 92.33915953886203 | 0.078 | -0.13 | -0.072 | 0.187 |
| 92.49721085905541 | 0.08 | -0.122 | -0.075 | 0.184 |
| 92.66455931573077 | 0.08 | -0.115 | -0.078 | 0.183 |
| 92.83190777240611 | 0.08 | -0.108 | -0.081 | 0.181 |
| 92.99925622908145 | 0.08 | -0.1 | -0.084 | 0.178 |
| 93.1666046857568 | 0.077 | -0.093 | -0.091 | 0.176 |
| 93.33395314243214 | 0.075 | -0.087 | -0.096 | 0.174 |
| 93.50130159910749 | 0.074 | -0.083 | -0.097 | 0.173 |
| 93.66865005578283 | 0.069 | -0.083 | -0.099 | 0.17 |
| 93.83599851245818 | 0.066 | -0.084 | -0.099 | 0.167 |
| 94.00334696913353 | 0.066 | -0.084 | -0.099 | 0.165 |
| 94.17069542580886 | 0.065 | -0.083 | -0.099 | 0.162 |
| 94.3380438824842 | 0.063 | -0.08 | -0.097 | 0.161 |
| 94.50539233915954 | 0.063 | -0.074 | -0.097 | 0.158 |
| 94.66344365935292 | 0.063 | -0.068 | -0.096 | 0.155 |
| 94.83079211602828 | 0.06 | -0.059 | -0.096 | 0.15 |
| 94.99814057270362 | 0.058 | -0.047 | -0.097 | 0.146 |
| 95.16548902937897 | 0.056 | -0.04 | -0.096 | 0.142 |
| 95.33283748605432 | 0.055 | -0.035 | -0.096 | 0.139 |
| 95.50018594272963 | 0.053 | -0.031 | -0.096 | 0.136 |
| 95.66753439940499 | 0.05 | -0.025 | -0.094 | 0.13 |
| 95.83488285608034 | 0.049 | -0.024 | -0.091 | 0.122 |
| 96.00223131275567 | 0.047 | -0.022 | -0.088 | 0.117 |
| 96.16957976943102 | 0.046 | -0.015 | -0.087 | 0.115 |
| 96.33692822610638 | 0.044 | -0.009 | -0.086 | 0.114 |
| 96.50427668278171 | 0.041 | -0.006 | -0.083 | 0.109 |
| 96.67162513945706 | 0.038 | -0.006 | -0.08 | 0.105 |
| 96.8389735961324 | 0.037 | 0 | -0.075 | 0.096 |
| 96.99702491632577 | 0.035 | 0.009 | -0.066 | 0.087 |
| 97.16437337300111 | 0.035 | 0.015 | -0.062 | 0.083 |
| 97.33172182967647 | 0.035 | 0.021 | -0.058 | 0.081 |
| 97.49907028635181 | 0.034 | 0.022 | -0.055 | 0.078 |
| 97.66641874302715 | 0.032 | 0.027 | -0.052 | 0.077 |
| 97.8337671997025 | 0.031 | 0.031 | -0.049 | 0.077 |
| 98.00111565637785 | 0.029 | 0.031 | -0.047 | 0.075 |
| 98.16846411305319 | 0.027 | 0.032 | -0.047 | 0.074 |
| 98.33581256972855 | 0.025 | 0.037 | -0.046 | 0.074 |
| 98.50316102640389 | 0.025 | 0.044 | -0.044 | 0.075 |
| 98.67050948307921 | 0.025 | 0.05 | -0.044 | 0.081 |
| 98.83785793975456 | 0.025 | 0.056 | -0.044 | 0.086 |
| 99.0052063964299 | 0.025 | 0.06 | -0.044 | 0.087 |
| 99.17255485310525 | 0.025 | 0.059 | -0.044 | 0.086 |
| 99.33060617329863 | 0.025 | 0.059 | -0.044 | 0.086 |
| 99.49795462997399 | 0.024 | 0.058 | -0.044 | 0.084 |
| 99.66530308664933 | 0.022 | 0.058 | -0.044 | 0.083 |
| 99.83265154332467 | 0.022 | 0.052 | -0.043 | 0.08 |
| 100.0 | 0.022 | 0.047 | -0.041 | 0.074 |